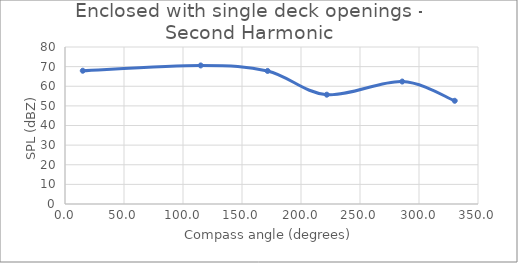
| Category | Series 0 |
|---|---|
| 15.06445125542554 | 67.9 |
| 115.00449447818254 | 70.6 |
| 171.7068171198818 | 67.8 |
| 221.8691292075067 | 55.7 |
| 285.7828166838848 | 62.4 |
| 330.28010595813004 | 52.6 |